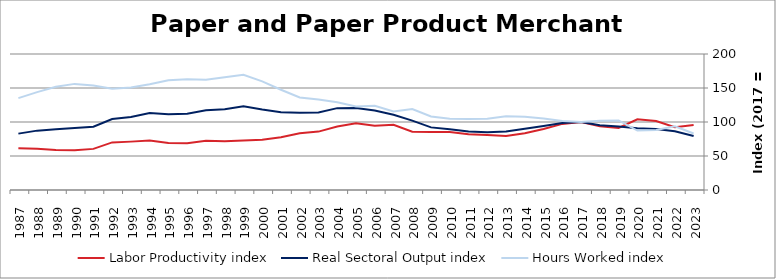
| Category | Labor Productivity index | Real Sectoral Output index | Hours Worked index |
|---|---|---|---|
| 2023.0 | 95.556 | 79.454 | 83.149 |
| 2022.0 | 92.244 | 86.376 | 93.638 |
| 2021.0 | 101.484 | 89.64 | 88.33 |
| 2020.0 | 103.958 | 90.925 | 87.463 |
| 2019.0 | 91.181 | 93.246 | 102.265 |
| 2018.0 | 93.773 | 95.377 | 101.71 |
| 2017.0 | 100 | 100 | 100 |
| 2016.0 | 97.201 | 98.572 | 101.409 |
| 2015.0 | 89.622 | 94.188 | 105.095 |
| 2014.0 | 83.526 | 90.002 | 107.753 |
| 2013.0 | 79.416 | 86.146 | 108.474 |
| 2012.0 | 80.951 | 84.952 | 104.942 |
| 2011.0 | 82.116 | 85.878 | 104.581 |
| 2010.0 | 85.375 | 89.411 | 104.727 |
| 2009.0 | 85.187 | 92.072 | 108.083 |
| 2008.0 | 85.646 | 102.034 | 119.136 |
| 2007.0 | 95.831 | 110.664 | 115.478 |
| 2006.0 | 94.548 | 116.975 | 123.72 |
| 2005.0 | 98.221 | 120.507 | 122.69 |
| 2004.0 | 93.311 | 120.375 | 129.005 |
| 2003.0 | 85.864 | 114.143 | 132.935 |
| 2002.0 | 83.49 | 113.529 | 135.979 |
| 2001.0 | 77.525 | 114.322 | 147.464 |
| 2000.0 | 74 | 118.254 | 159.804 |
| 1999.0 | 72.632 | 122.972 | 169.309 |
| 1998.0 | 71.58 | 118.658 | 165.77 |
| 1997.0 | 72.441 | 117.411 | 162.079 |
| 1996.0 | 68.873 | 112.122 | 162.796 |
| 1995.0 | 69.029 | 111.35 | 161.31 |
| 1994.0 | 72.676 | 113.072 | 155.583 |
| 1993.0 | 71.14 | 107.34 | 150.885 |
| 1992.0 | 70.018 | 104.381 | 149.078 |
| 1991.0 | 60.477 | 92.962 | 153.716 |
| 1990.0 | 58.349 | 91.056 | 156.055 |
| 1989.0 | 58.845 | 89.386 | 151.902 |
| 1988.0 | 60.647 | 87.311 | 143.965 |
| 1987.0 | 61.395 | 82.92 | 135.06 |